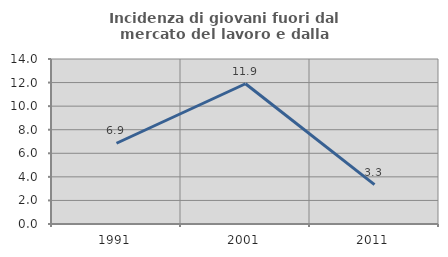
| Category | Incidenza di giovani fuori dal mercato del lavoro e dalla formazione  |
|---|---|
| 1991.0 | 6.852 |
| 2001.0 | 11.899 |
| 2011.0 | 3.342 |